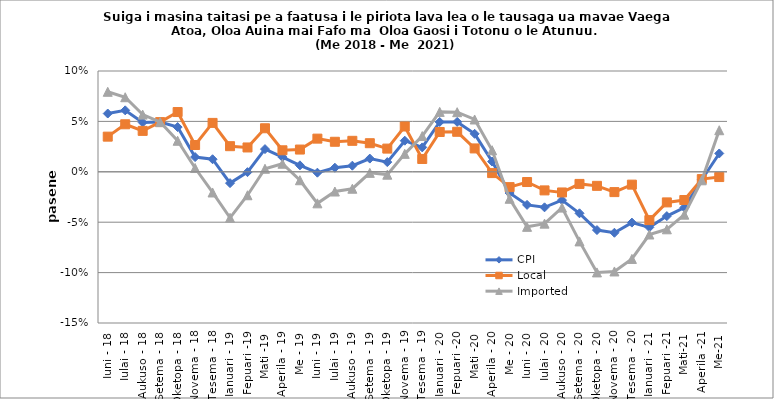
| Category | CPI | Local | Imported |
|---|---|---|---|
| Iuni - 18 | 0.058 | 0.035 | 0.079 |
| Iulai - 18 | 0.061 | 0.047 | 0.074 |
| Aukuso - 18 | 0.049 | 0.041 | 0.057 |
| Setema - 18 | 0.049 | 0.049 | 0.049 |
| Oketopa - 18 | 0.044 | 0.059 | 0.031 |
| Novema - 18 | 0.015 | 0.027 | 0.004 |
| Tesema - 18 | 0.012 | 0.049 | -0.021 |
| Ianuari - 19 | -0.011 | 0.025 | -0.046 |
| Fepuari -19 | 0 | 0.024 | -0.023 |
| Mati -19 | 0.023 | 0.043 | 0.003 |
| Aperila - 19 | 0.015 | 0.021 | 0.008 |
| Me - 19 | 0.006 | 0.022 | -0.008 |
| Iuni - 19 | -0.001 | 0.033 | -0.031 |
| Iulai - 19 | 0.004 | 0.03 | -0.02 |
| Aukuso - 19 | 0.006 | 0.031 | -0.017 |
| Setema - 19 | 0.013 | 0.028 | -0.001 |
| Oketopa - 19 | 0.01 | 0.023 | -0.003 |
| Novema - 19 | 0.031 | 0.045 | 0.018 |
| Tesema - 19 | 0.024 | 0.013 | 0.035 |
| Ianuari - 20 | 0.049 | 0.039 | 0.059 |
| Fepuari -20 | 0.05 | 0.04 | 0.059 |
| Mati -20 | 0.038 | 0.023 | 0.052 |
| Aperila - 20 | 0.01 | -0.001 | 0.021 |
| Me - 20 | -0.021 | -0.015 | -0.027 |
| Iuni - 20 | -0.033 | -0.01 | -0.055 |
| Iulai - 20 | -0.035 | -0.018 | -0.051 |
| Aukuso - 20 | -0.028 | -0.02 | -0.036 |
| Setema - 20 | -0.041 | -0.012 | -0.069 |
| Oketopa - 20 | -0.058 | -0.014 | -0.1 |
| Novema - 20 | -0.06 | -0.02 | -0.099 |
| Tesema - 20 | -0.05 | -0.013 | -0.086 |
| Ianuari - 21 | -0.055 | -0.048 | -0.062 |
| Fepuari -21 | -0.044 | -0.03 | -0.057 |
| Mati-21 | -0.035 | -0.028 | -0.043 |
| Aperila -21 | -0.008 | -0.007 | -0.008 |
| Me-21 | 0.018 | -0.005 | 0.041 |